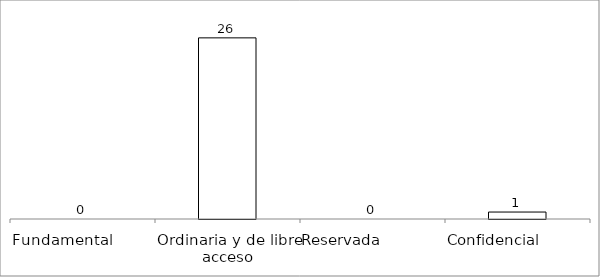
| Category | Series 0 |
|---|---|
| Fundamental         | 0 |
| Ordinaria y de libre acceso | 26 |
| Reservada               | 0 |
| Confidencial             | 1 |